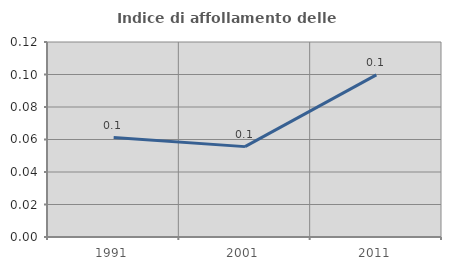
| Category | Indice di affollamento delle abitazioni  |
|---|---|
| 1991.0 | 0.061 |
| 2001.0 | 0.056 |
| 2011.0 | 0.1 |